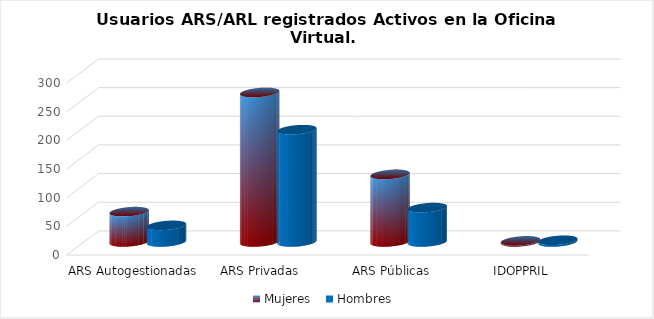
| Category | Mujeres | Hombres |
|---|---|---|
| ARS Autogestionadas | 53 | 29 |
| ARS Privadas | 261 | 196 |
| ARS Públicas | 118 | 60 |
| IDOPPRIL | 2 | 3 |